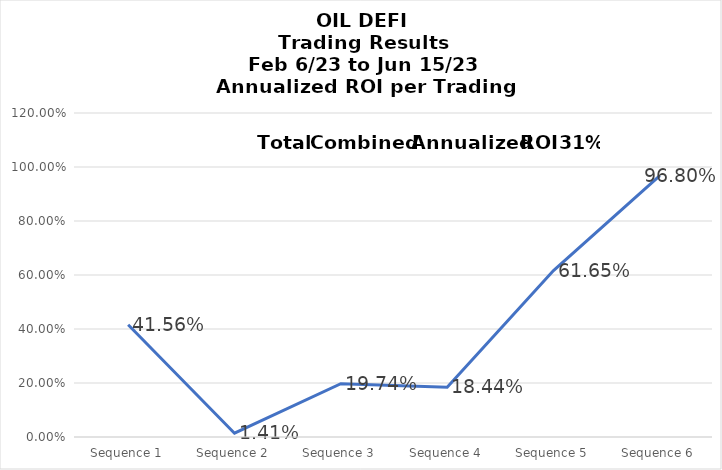
| Category | ROI |
|---|---|
| Sequence 1 | 0.416 |
| Sequence 2 | 0.014 |
| Sequence 3 | 0.197 |
| Sequence 4 | 0.184 |
| Sequence 5 | 0.616 |
| Sequence 6 | 0.968 |